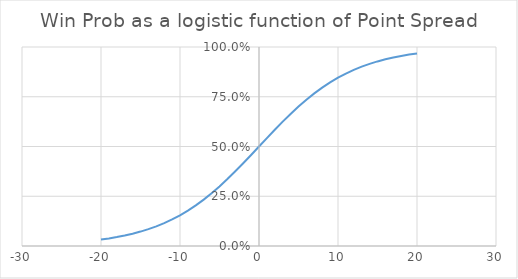
| Category | Series 0 |
|---|---|
| -20.0 | 0.032 |
| -19.0 | 0.038 |
| -18.0 | 0.045 |
| -17.0 | 0.053 |
| -16.0 | 0.062 |
| -15.0 | 0.072 |
| -14.0 | 0.085 |
| -13.0 | 0.099 |
| -12.0 | 0.115 |
| -11.0 | 0.134 |
| -10.0 | 0.154 |
| -9.0 | 0.178 |
| -8.0 | 0.204 |
| -7.0 | 0.233 |
| -6.0 | 0.265 |
| -5.0 | 0.299 |
| -4.0 | 0.336 |
| -3.0 | 0.375 |
| -2.0 | 0.416 |
| -1.0 | 0.458 |
| 0.0 | 0.5 |
| 1.0 | 0.542 |
| 2.0 | 0.584 |
| 3.0 | 0.625 |
| 4.0 | 0.664 |
| 5.0 | 0.701 |
| 6.0 | 0.735 |
| 7.0 | 0.767 |
| 8.0 | 0.796 |
| 9.0 | 0.822 |
| 10.0 | 0.846 |
| 11.0 | 0.866 |
| 12.0 | 0.885 |
| 13.0 | 0.901 |
| 14.0 | 0.915 |
| 15.0 | 0.928 |
| 16.0 | 0.938 |
| 17.0 | 0.947 |
| 18.0 | 0.955 |
| 19.0 | 0.962 |
| 20.0 | 0.968 |